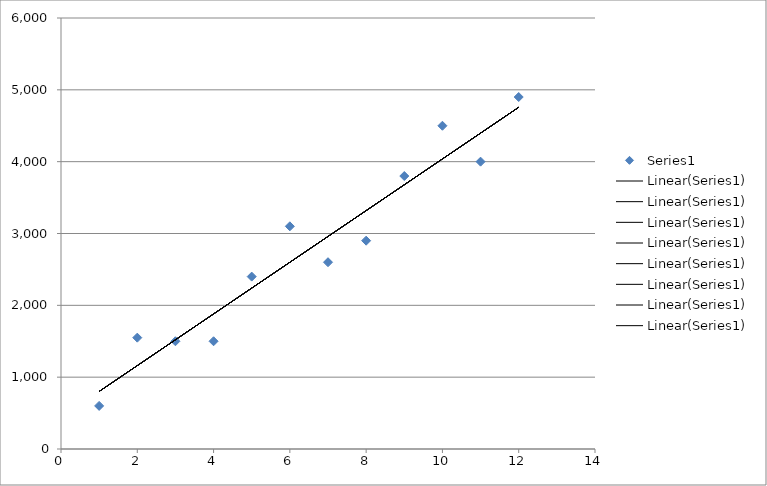
| Category | Series 0 |
|---|---|
| 1.0 | 600 |
| 2.0 | 1550 |
| 3.0 | 1500 |
| 4.0 | 1500 |
| 5.0 | 2400 |
| 6.0 | 3100 |
| 7.0 | 2600 |
| 8.0 | 2900 |
| 9.0 | 3800 |
| 10.0 | 4500 |
| 11.0 | 4000 |
| 12.0 | 4900 |